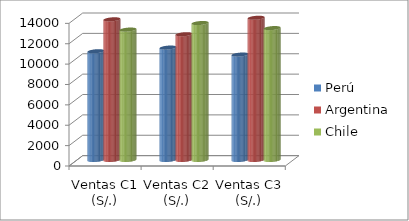
| Category | Perú | Argentina | Chile |
|---|---|---|---|
| Ventas C1  (S/.)  | 10675 | 13807 | 12799 |
| Ventas C2  (S/.)  | 11034 | 12345 | 13443 |
| Ventas C3  (S/.)  | 10348 | 13958 | 12947 |